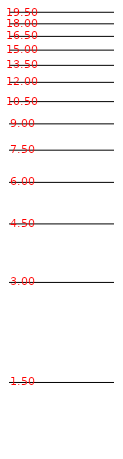
| Category | Series 0 |
|---|---|
| 0.0 | 0.405 |
| 0.0 | 1.099 |
| 0.0 | 1.504 |
| 0.0 | 1.792 |
| 0.0 | 2.015 |
| 0.0 | 2.197 |
| 0.0 | 2.351 |
| 0.0 | 2.485 |
| 0.0 | 2.603 |
| 0.0 | 2.708 |
| 0.0 | 2.803 |
| 0.0 | 2.89 |
| 0.0 | 2.97 |
| 0.0 | 3.045 |
| 0.0 | 3.114 |
| 0.0 | 3.178 |
| 0.0 | 3.239 |
| 0.0 | 3.296 |
| 0.0 | 3.35 |
| 0.0 | 3.401 |
| 0.0 | 3.45 |
| 0.0 | 3.497 |
| 0.0 | 3.541 |
| 0.0 | 3.584 |
| 0.0 | 3.624 |
| 0.0 | 3.664 |
| 0.0 | 3.701 |